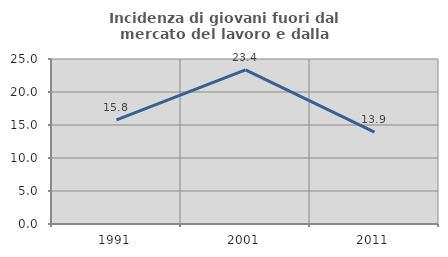
| Category | Incidenza di giovani fuori dal mercato del lavoro e dalla formazione  |
|---|---|
| 1991.0 | 15.763 |
| 2001.0 | 23.351 |
| 2011.0 | 13.913 |